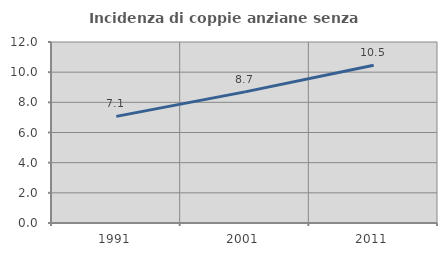
| Category | Incidenza di coppie anziane senza figli  |
|---|---|
| 1991.0 | 7.067 |
| 2001.0 | 8.692 |
| 2011.0 | 10.453 |